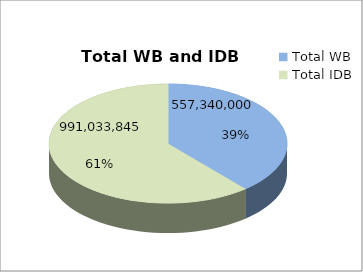
| Category | Series 0 |
|---|---|
| Total WB | 687340000 |
| Total IDB | 1086740151 |